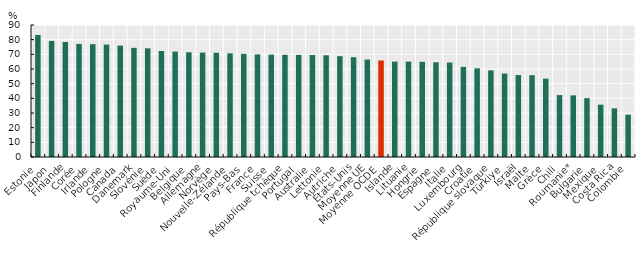
| Category | Baseline allrounder |
|---|---|
| Estonie | 83.204 |
| Japon | 79.178 |
| Finlande | 78.426 |
| Corée | 77.1 |
| Irlande | 76.924 |
| Pologne | 76.665 |
| Canada | 75.926 |
| Danemark | 74.429 |
| Slovénie | 74.103 |
| Suède | 72.246 |
| Royaume­Uni | 71.862 |
| Belgique | 71.37 |
| Allemagne | 71.182 |
| Norvège | 71.072 |
| Nouvelle­Zélande | 70.656 |
| Pays­Bas | 70.335 |
| France | 69.975 |
| Suisse | 69.793 |
| République tchèque | 69.667 |
| Portugal | 69.641 |
| Australie | 69.524 |
| Lettonie | 69.363 |
| Autriche | 68.728 |
| États­Unis | 68.035 |
| Moyenne UE | 66.439 |
| Moyenne OCDE | 65.787 |
| Islande | 65.029 |
| Lituanie | 65.024 |
| Hongrie | 64.883 |
| Espagne | 64.566 |
| Italie | 64.404 |
| Luxembourg | 61.435 |
| Croatie | 60.469 |
| République slovaque | 59.036 |
| Türkiye | 56.916 |
| Israël | 55.881 |
| Malte | 55.782 |
| Grèce | 53.418 |
| Chili | 42.218 |
| Roumanie* | 42.031 |
| Bulgarie | 40.106 |
| Mexique | 35.678 |
| Costa Rica | 33.186 |
| Colombie | 28.842 |